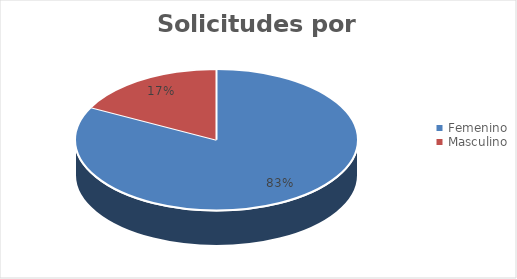
| Category | Cantidad |
|---|---|
| Femenino | 19 |
| Masculino | 4 |